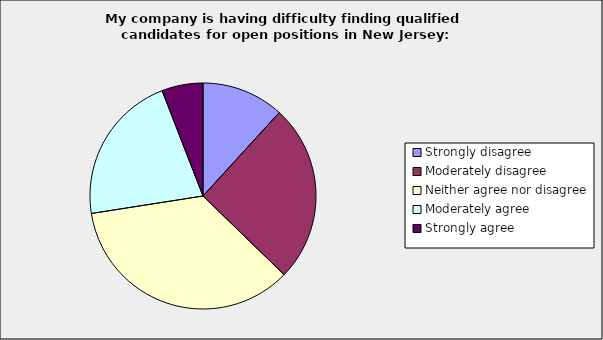
| Category | Series 0 |
|---|---|
| Strongly disagree | 0.118 |
| Moderately disagree | 0.255 |
| Neither agree nor disagree | 0.353 |
| Moderately agree | 0.216 |
| Strongly agree | 0.059 |